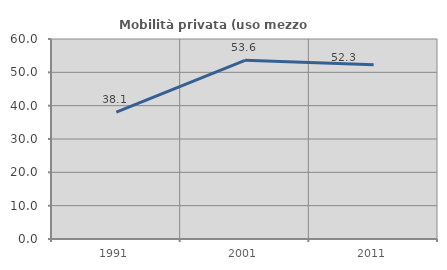
| Category | Mobilità privata (uso mezzo privato) |
|---|---|
| 1991.0 | 38.091 |
| 2001.0 | 53.604 |
| 2011.0 | 52.278 |